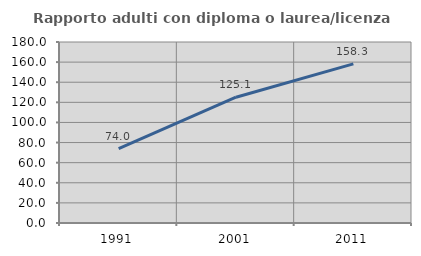
| Category | Rapporto adulti con diploma o laurea/licenza media  |
|---|---|
| 1991.0 | 73.98 |
| 2001.0 | 125.106 |
| 2011.0 | 158.264 |